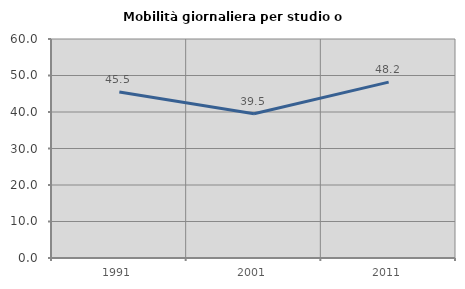
| Category | Mobilità giornaliera per studio o lavoro |
|---|---|
| 1991.0 | 45.456 |
| 2001.0 | 39.499 |
| 2011.0 | 48.18 |